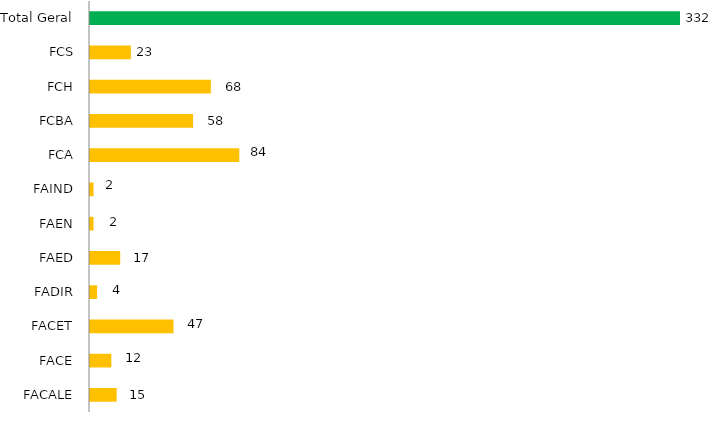
| Category | Faculdade/mês |
|---|---|
| FACALE | 15 |
| FACE | 12 |
| FACET | 47 |
| FADIR | 4 |
| FAED | 17 |
| FAEN | 2 |
| FAIND | 2 |
| FCA | 84 |
| FCBA | 58 |
| FCH | 68 |
| FCS | 23 |
| Total Geral | 332 |